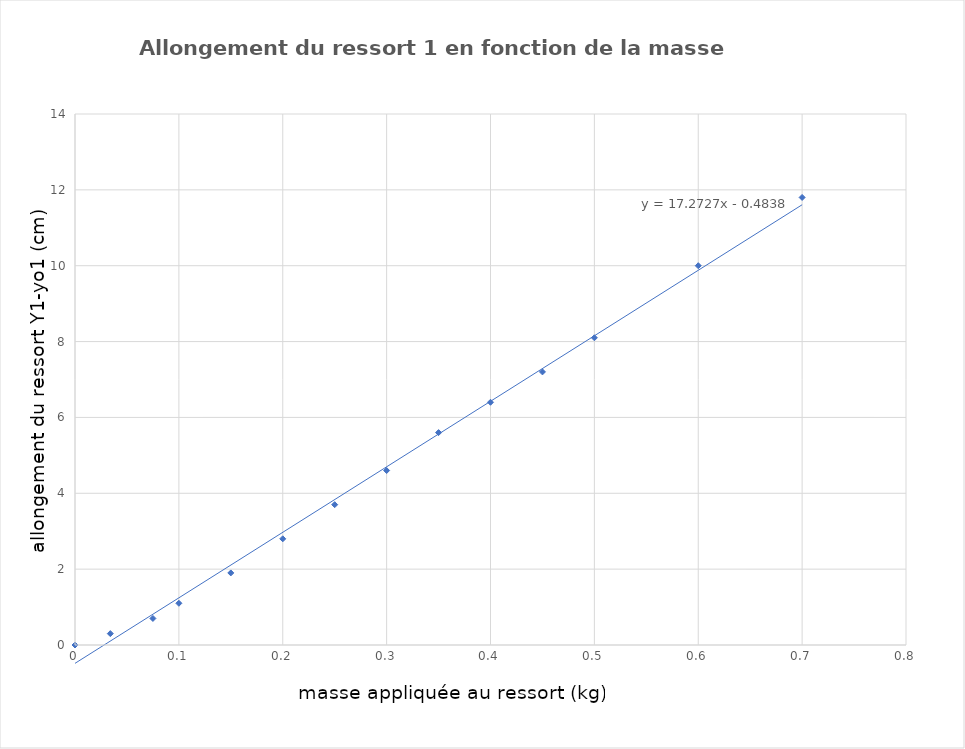
| Category | Series 0 |
|---|---|
| 0.034 | 0.3 |
| 0.075 | 0.7 |
| 0.1 | 1.1 |
| 0.15 | 1.9 |
| 0.2 | 2.8 |
| 0.25 | 3.7 |
| 0.3 | 4.6 |
| 0.35 | 5.6 |
| 0.4 | 6.4 |
| 0.45 | 7.2 |
| 0.5 | 8.1 |
| 0.6 | 10 |
| 0.7 | 11.8 |
| 0.0 | 0 |